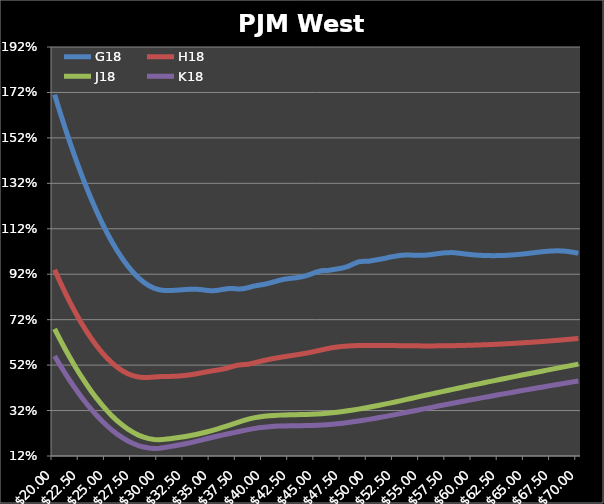
| Category | G18 | H18 | J18 | K18 |
|---|---|---|---|---|
| 20.0 | 1.71 | 0.94 | 0.679 | 0.56 |
| 20.5 | 1.636 | 0.888 | 0.634 | 0.522 |
| 21.0 | 1.564 | 0.839 | 0.591 | 0.484 |
| 21.5 | 1.495 | 0.793 | 0.55 | 0.449 |
| 22.0 | 1.429 | 0.75 | 0.511 | 0.415 |
| 22.5 | 1.366 | 0.71 | 0.473 | 0.383 |
| 23.0 | 1.307 | 0.672 | 0.438 | 0.353 |
| 23.5 | 1.251 | 0.637 | 0.405 | 0.325 |
| 24.0 | 1.198 | 0.605 | 0.374 | 0.299 |
| 24.5 | 1.148 | 0.577 | 0.346 | 0.275 |
| 25.0 | 1.103 | 0.551 | 0.32 | 0.253 |
| 25.5 | 1.06 | 0.529 | 0.296 | 0.233 |
| 26.0 | 1.021 | 0.51 | 0.274 | 0.215 |
| 26.5 | 0.986 | 0.494 | 0.255 | 0.2 |
| 27.0 | 0.955 | 0.482 | 0.238 | 0.186 |
| 27.5 | 0.928 | 0.473 | 0.224 | 0.175 |
| 28.0 | 0.904 | 0.468 | 0.212 | 0.166 |
| 28.5 | 0.885 | 0.466 | 0.203 | 0.159 |
| 29.0 | 0.87 | 0.466 | 0.196 | 0.155 |
| 29.5 | 0.858 | 0.468 | 0.193 | 0.154 |
| 30.0 | 0.851 | 0.469 | 0.192 | 0.154 |
| 30.5 | 0.848 | 0.47 | 0.193 | 0.157 |
| 31.0 | 0.848 | 0.47 | 0.196 | 0.161 |
| 31.5 | 0.849 | 0.471 | 0.199 | 0.165 |
| 32.0 | 0.851 | 0.473 | 0.202 | 0.169 |
| 32.5 | 0.853 | 0.475 | 0.206 | 0.174 |
| 33.0 | 0.854 | 0.478 | 0.21 | 0.179 |
| 33.5 | 0.854 | 0.482 | 0.215 | 0.184 |
| 34.0 | 0.852 | 0.486 | 0.22 | 0.19 |
| 34.5 | 0.849 | 0.49 | 0.226 | 0.196 |
| 35.0 | 0.847 | 0.494 | 0.232 | 0.201 |
| 35.5 | 0.849 | 0.498 | 0.239 | 0.207 |
| 36.0 | 0.853 | 0.502 | 0.246 | 0.212 |
| 36.5 | 0.856 | 0.507 | 0.253 | 0.217 |
| 37.0 | 0.857 | 0.514 | 0.261 | 0.222 |
| 37.5 | 0.855 | 0.52 | 0.268 | 0.227 |
| 38.0 | 0.856 | 0.522 | 0.275 | 0.232 |
| 38.5 | 0.861 | 0.524 | 0.282 | 0.236 |
| 39.0 | 0.868 | 0.529 | 0.288 | 0.24 |
| 39.5 | 0.872 | 0.535 | 0.292 | 0.244 |
| 40.0 | 0.875 | 0.541 | 0.295 | 0.247 |
| 40.5 | 0.881 | 0.546 | 0.297 | 0.249 |
| 41.0 | 0.887 | 0.55 | 0.299 | 0.251 |
| 41.5 | 0.894 | 0.554 | 0.3 | 0.252 |
| 42.0 | 0.899 | 0.558 | 0.301 | 0.252 |
| 42.5 | 0.902 | 0.561 | 0.301 | 0.253 |
| 43.0 | 0.904 | 0.565 | 0.302 | 0.253 |
| 43.5 | 0.908 | 0.569 | 0.302 | 0.254 |
| 44.0 | 0.913 | 0.573 | 0.303 | 0.254 |
| 44.5 | 0.921 | 0.577 | 0.304 | 0.254 |
| 45.0 | 0.93 | 0.582 | 0.305 | 0.255 |
| 45.5 | 0.936 | 0.587 | 0.306 | 0.256 |
| 46.0 | 0.936 | 0.592 | 0.308 | 0.258 |
| 46.5 | 0.94 | 0.597 | 0.31 | 0.26 |
| 47.0 | 0.943 | 0.6 | 0.313 | 0.262 |
| 47.5 | 0.947 | 0.602 | 0.316 | 0.265 |
| 48.0 | 0.954 | 0.604 | 0.319 | 0.267 |
| 48.5 | 0.965 | 0.605 | 0.323 | 0.27 |
| 49.0 | 0.974 | 0.606 | 0.326 | 0.274 |
| 49.5 | 0.977 | 0.606 | 0.33 | 0.277 |
| 50.0 | 0.977 | 0.607 | 0.334 | 0.281 |
| 50.5 | 0.981 | 0.607 | 0.339 | 0.285 |
| 51.0 | 0.986 | 0.607 | 0.343 | 0.289 |
| 51.5 | 0.989 | 0.606 | 0.348 | 0.293 |
| 52.0 | 0.995 | 0.606 | 0.353 | 0.298 |
| 52.5 | 0.999 | 0.606 | 0.358 | 0.302 |
| 53.0 | 1.003 | 0.606 | 0.363 | 0.307 |
| 53.5 | 1.005 | 0.605 | 0.368 | 0.311 |
| 54.0 | 1.004 | 0.605 | 0.373 | 0.316 |
| 54.5 | 1.003 | 0.605 | 0.378 | 0.32 |
| 55.0 | 1.003 | 0.605 | 0.383 | 0.325 |
| 55.5 | 1.004 | 0.605 | 0.388 | 0.33 |
| 56.0 | 1.007 | 0.605 | 0.393 | 0.334 |
| 56.5 | 1.01 | 0.605 | 0.398 | 0.339 |
| 57.0 | 1.013 | 0.605 | 0.403 | 0.343 |
| 57.5 | 1.015 | 0.605 | 0.408 | 0.348 |
| 58.0 | 1.015 | 0.606 | 0.413 | 0.352 |
| 58.5 | 1.013 | 0.606 | 0.418 | 0.356 |
| 59.0 | 1.01 | 0.607 | 0.423 | 0.361 |
| 59.5 | 1.007 | 0.607 | 0.428 | 0.365 |
| 60.0 | 1.005 | 0.608 | 0.433 | 0.369 |
| 60.5 | 1.004 | 0.609 | 0.438 | 0.374 |
| 61.0 | 1.002 | 0.609 | 0.442 | 0.378 |
| 61.5 | 1.002 | 0.61 | 0.447 | 0.382 |
| 62.0 | 1.002 | 0.611 | 0.452 | 0.386 |
| 62.5 | 1.002 | 0.613 | 0.457 | 0.39 |
| 63.0 | 1.003 | 0.614 | 0.461 | 0.395 |
| 63.5 | 1.004 | 0.615 | 0.466 | 0.399 |
| 64.0 | 1.006 | 0.616 | 0.471 | 0.403 |
| 64.5 | 1.008 | 0.618 | 0.475 | 0.407 |
| 65.0 | 1.01 | 0.619 | 0.48 | 0.411 |
| 65.5 | 1.013 | 0.621 | 0.484 | 0.415 |
| 66.0 | 1.016 | 0.622 | 0.489 | 0.419 |
| 66.5 | 1.019 | 0.624 | 0.493 | 0.423 |
| 67.0 | 1.021 | 0.626 | 0.498 | 0.427 |
| 67.5 | 1.022 | 0.627 | 0.502 | 0.431 |
| 68.0 | 1.023 | 0.629 | 0.507 | 0.435 |
| 68.5 | 1.022 | 0.631 | 0.511 | 0.439 |
| 69.0 | 1.02 | 0.633 | 0.516 | 0.442 |
| 69.5 | 1.016 | 0.635 | 0.52 | 0.446 |
| 70.0 | 1.013 | 0.637 | 0.524 | 0.45 |